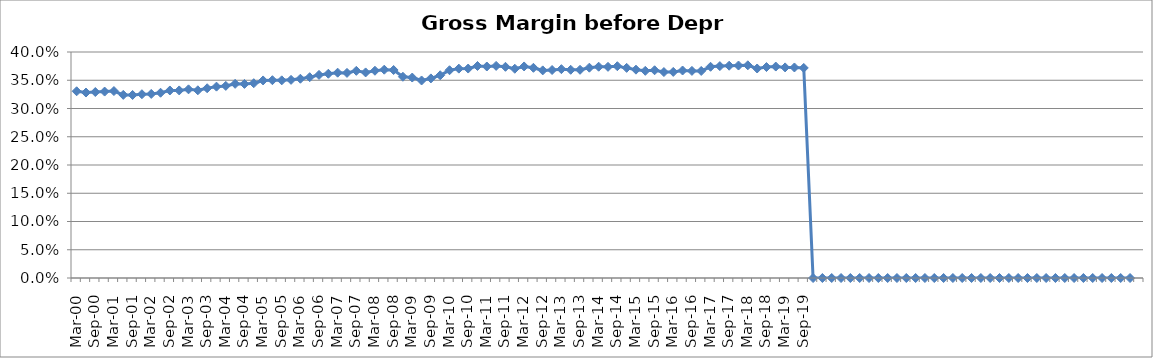
| Category | Gross Margin (before depr) % |
|---|---|
| Mar-00 | 0.331 |
| Jun-00 | 0.328 |
| Sep-00 | 0.329 |
| Dec-00 | 0.33 |
| Mar-01 | 0.331 |
| Jun-01 | 0.324 |
| Sep-01 | 0.324 |
| Dec-01 | 0.325 |
| Mar-02 | 0.326 |
| Jun-02 | 0.328 |
| Sep-02 | 0.332 |
| Dec-02 | 0.332 |
| Mar-03 | 0.334 |
| Jun-03 | 0.332 |
| Sep-03 | 0.336 |
| Dec-03 | 0.339 |
| Mar-04 | 0.34 |
| Jun-04 | 0.344 |
| Sep-04 | 0.343 |
| Dec-04 | 0.345 |
| Mar-05 | 0.35 |
| Jun-05 | 0.35 |
| Sep-05 | 0.35 |
| Dec-05 | 0.351 |
| Mar-06 | 0.353 |
| Jun-06 | 0.355 |
| Sep-06 | 0.359 |
| Dec-06 | 0.362 |
| Mar-07 | 0.363 |
| Jun-07 | 0.363 |
| Sep-07 | 0.367 |
| Dec-07 | 0.364 |
| Mar-08 | 0.367 |
| Jun-08 | 0.369 |
| Sep-08 | 0.368 |
| Dec-08 | 0.356 |
| Mar-09 | 0.355 |
| Jun-09 | 0.35 |
| Sep-09 | 0.353 |
| Dec-09 | 0.359 |
| Mar-10 | 0.368 |
| Jun-10 | 0.371 |
| Sep-10 | 0.371 |
| Dec-10 | 0.375 |
| Mar-11 | 0.374 |
| Jun-11 | 0.375 |
| Sep-11 | 0.374 |
| Dec-11 | 0.37 |
| Mar-12 | 0.374 |
| Jun-12 | 0.372 |
| Sep-12 | 0.367 |
| Dec-12 | 0.368 |
| Mar-13 | 0.37 |
| Jun-13 | 0.369 |
| Sep-13 | 0.369 |
| Dec-13 | 0.372 |
| Mar-14 | 0.374 |
| Jun-14 | 0.374 |
| Sep-14 | 0.375 |
| Dec-14 | 0.372 |
| Mar-15 | 0.369 |
| Jun-15 | 0.367 |
| Sep-15 | 0.368 |
| Dec-15 | 0.364 |
| Mar-16 | 0.365 |
| Jun-16 | 0.367 |
| Sep-16 | 0.367 |
| Dec-16 | 0.366 |
| Mar-17 | 0.374 |
| Jun-17 | 0.375 |
| Sep-17 | 0.376 |
| Dec-17 | 0.376 |
| Mar-18 | 0.376 |
| Jun-18 | 0.371 |
| Sep-18 | 0.373 |
| Dec-18 | 0.374 |
| Mar-19 | 0.373 |
| Jun-19 | 0.373 |
| Sep-19 | 0.372 |